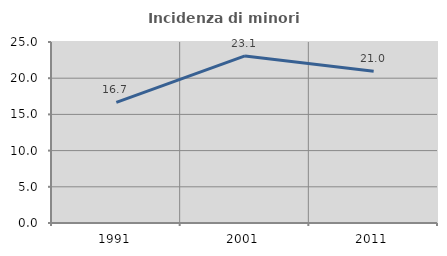
| Category | Incidenza di minori stranieri |
|---|---|
| 1991.0 | 16.667 |
| 2001.0 | 23.077 |
| 2011.0 | 20.968 |